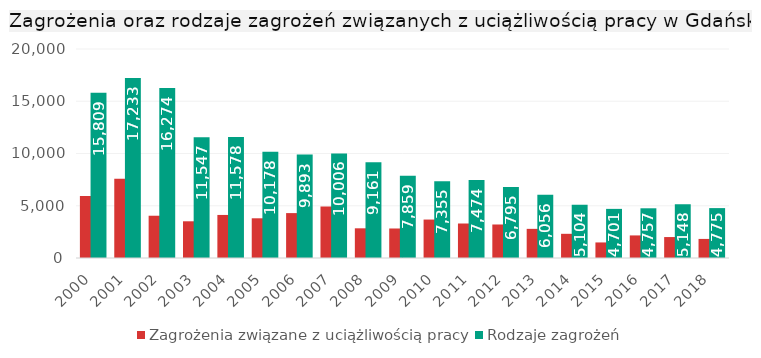
| Category | Zagrożenia związane z uciążliwością pracy | Rodzaje zagrożeń |
|---|---|---|
| 2000.0 | 5942 | 15809 |
| 2001.0 | 7580 | 17233 |
| 2002.0 | 4045 | 16274 |
| 2003.0 | 3513 | 11547 |
| 2004.0 | 4120 | 11578 |
| 2005.0 | 3800 | 10178 |
| 2006.0 | 4297 | 9893 |
| 2007.0 | 4940 | 10006 |
| 2008.0 | 2841 | 9161 |
| 2009.0 | 2824 | 7859 |
| 2010.0 | 3679 | 7355 |
| 2011.0 | 3301 | 7474 |
| 2012.0 | 3207 | 6795 |
| 2013.0 | 2789 | 6056 |
| 2014.0 | 2315 | 5104 |
| 2015.0 | 1489 | 4701 |
| 2016.0 | 2161 | 4757 |
| 2017.0 | 2004 | 5148 |
| 2018.0 | 1826 | 4775 |